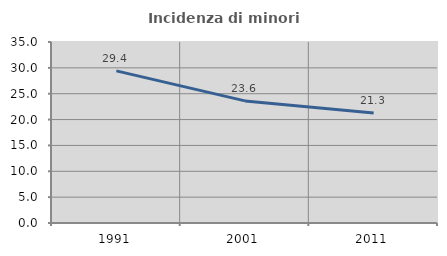
| Category | Incidenza di minori stranieri |
|---|---|
| 1991.0 | 29.412 |
| 2001.0 | 23.611 |
| 2011.0 | 21.26 |